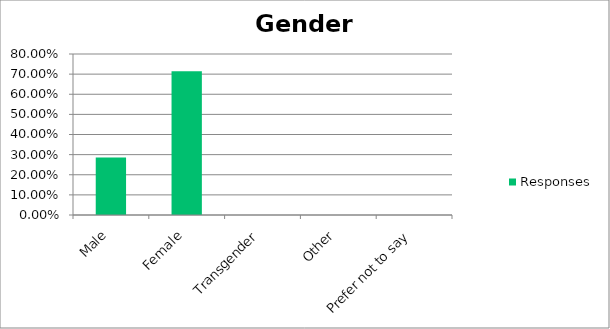
| Category | Responses |
|---|---|
| Male | 0.286 |
| Female | 0.714 |
| Transgender | 0 |
| Other | 0 |
| Prefer not to say | 0 |